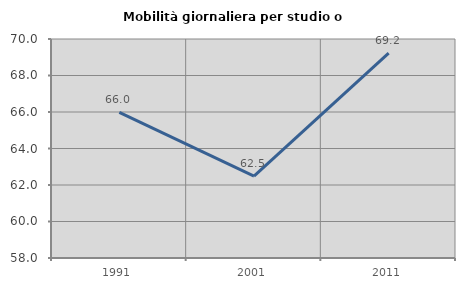
| Category | Mobilità giornaliera per studio o lavoro |
|---|---|
| 1991.0 | 65.984 |
| 2001.0 | 62.487 |
| 2011.0 | 69.224 |